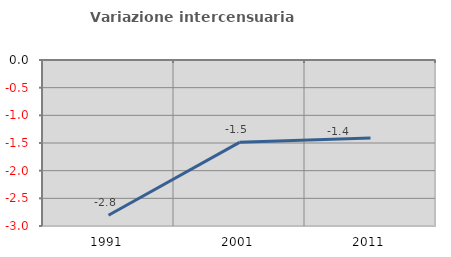
| Category | Variazione intercensuaria annua |
|---|---|
| 1991.0 | -2.805 |
| 2001.0 | -1.488 |
| 2011.0 | -1.41 |